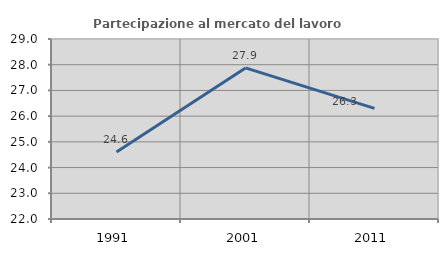
| Category | Partecipazione al mercato del lavoro  femminile |
|---|---|
| 1991.0 | 24.604 |
| 2001.0 | 27.877 |
| 2011.0 | 26.3 |